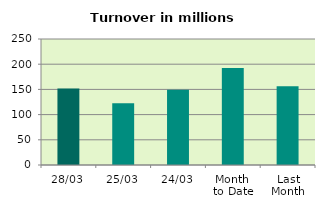
| Category | Series 0 |
|---|---|
| 28/03 | 151.91 |
| 25/03 | 122.5 |
| 24/03 | 149.066 |
| Month 
to Date | 192.341 |
| Last
Month | 156.222 |